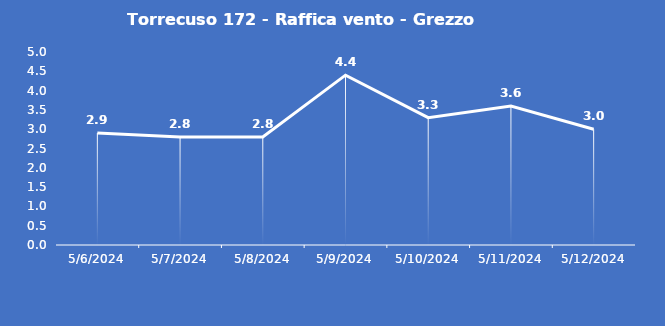
| Category | Torrecuso 172 - Raffica vento - Grezzo (m/s) |
|---|---|
| 5/6/24 | 2.9 |
| 5/7/24 | 2.8 |
| 5/8/24 | 2.8 |
| 5/9/24 | 4.4 |
| 5/10/24 | 3.3 |
| 5/11/24 | 3.6 |
| 5/12/24 | 3 |